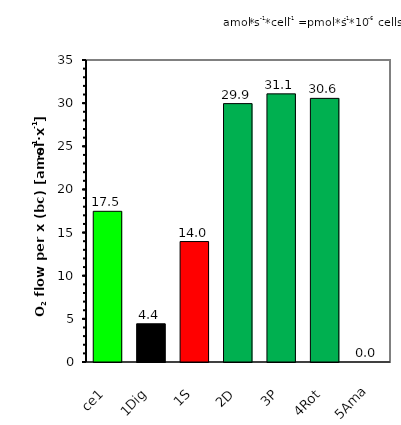
| Category | O2 flow per x (bc) |
|---|---|
| ce1 | 17.465 |
| 1Dig | 4.429 |
| 1S | 13.961 |
| 2D | 29.945 |
| 3P | 31.074 |
| 4Rot | 30.553 |
| 5Ama | 0 |